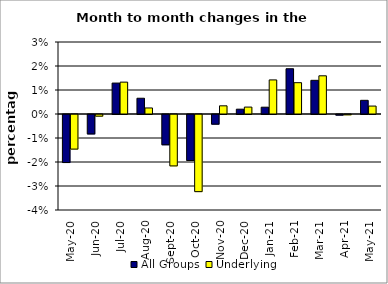
| Category | All Groups | Underlying |
|---|---|---|
| 2020-05-01 | -0.02 | -0.014 |
| 2020-06-01 | -0.008 | -0.001 |
| 2020-07-01 | 0.013 | 0.013 |
| 2020-08-01 | 0.007 | 0.003 |
| 2020-09-01 | -0.013 | -0.021 |
| 2020-10-01 | -0.019 | -0.032 |
| 2020-11-01 | -0.004 | 0.003 |
| 2020-12-01 | 0.002 | 0.003 |
| 2021-01-01 | 0.003 | 0.014 |
| 2021-02-01 | 0.019 | 0.013 |
| 2021-03-01 | 0.014 | 0.016 |
| 2021-04-01 | 0 | 0 |
| 2021-05-01 | 0.006 | 0.003 |